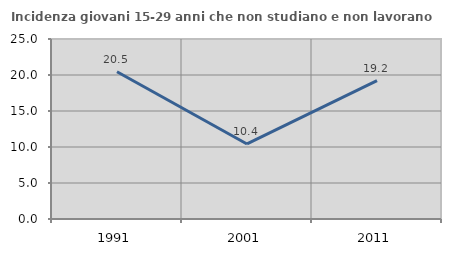
| Category | Incidenza giovani 15-29 anni che non studiano e non lavorano  |
|---|---|
| 1991.0 | 20.455 |
| 2001.0 | 10.423 |
| 2011.0 | 19.218 |